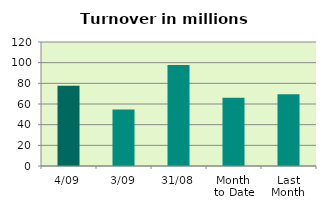
| Category | Series 0 |
|---|---|
| 4/09 | 77.657 |
| 3/09 | 54.624 |
| 31/08 | 97.828 |
| Month 
to Date | 66.14 |
| Last
Month | 69.378 |